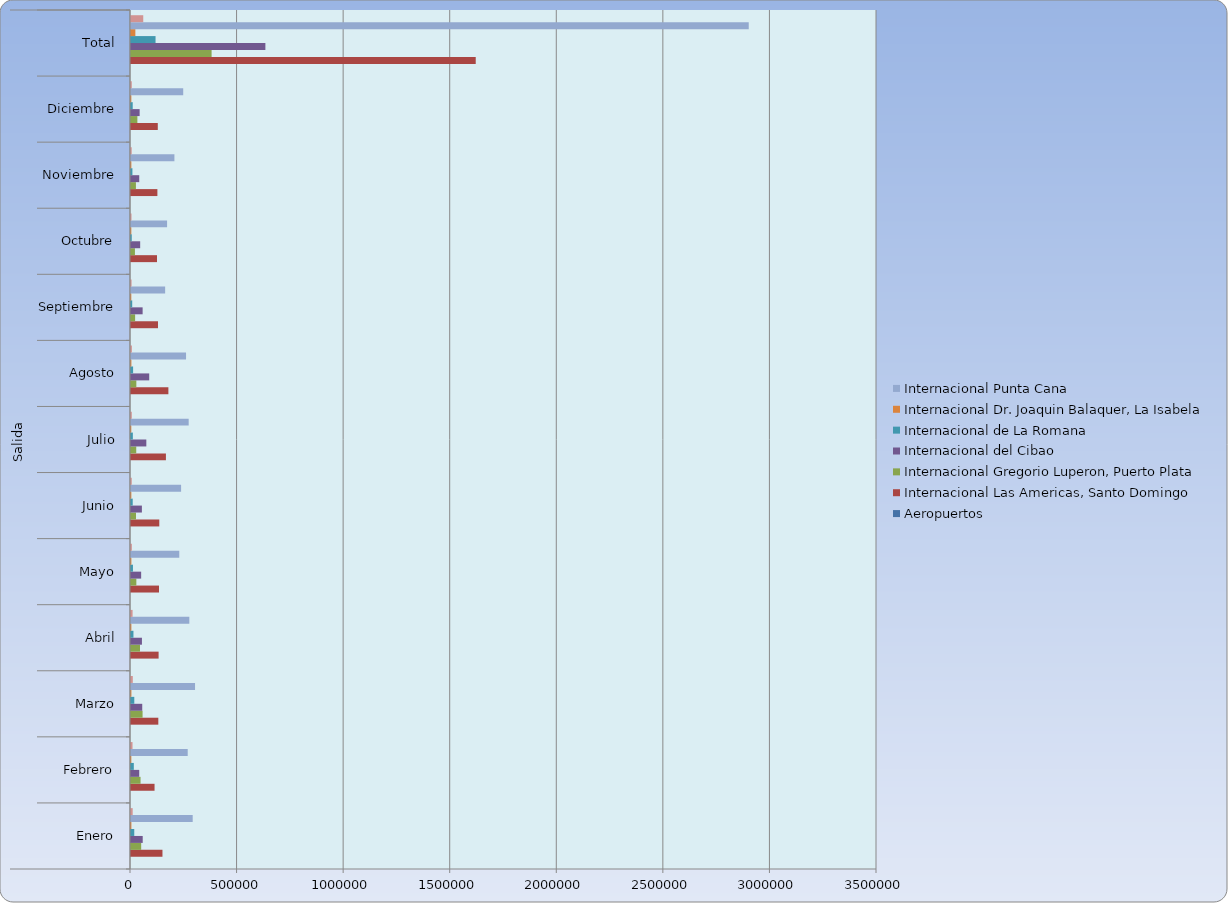
| Category | Aeropuertos | Internacional Las Americas, Santo Domingo | Internacional Gregorio Luperon, Puerto Plata  | Internacional del Cibao | Internacional de La Romana  | Internacional Dr. Joaquin Balaquer, La Isabela | Internacional Punta Cana  | Internacional Profesor Juan Bosch, El Catey (Samana) |
|---|---|---|---|---|---|---|---|---|
| 0 |  | 147614 | 47812 | 54965 | 15292 | 1836 | 289428 | 7859 |
| 1 |  | 110472 | 44794 | 38565 | 13227 | 1578 | 266055 | 7113 |
| 2 |  | 128154 | 54306 | 52724 | 15464 | 1958 | 300477 | 8384 |
| 3 |  | 129521 | 42262 | 51298 | 11484 | 1795 | 273648 | 7434 |
| 4 |  | 131419 | 25081 | 47645 | 9150 | 1862 | 226517 | 3872 |
| 5 |  | 132746 | 23472 | 51088 | 8068 | 1637 | 235039 | 3481 |
| 6 |  | 163825 | 24567 | 71906 | 8674 | 1447 | 270608 | 3667 |
| 7 |  | 175389 | 25061 | 85483 | 9860 | 1922 | 258300 | 4036 |
| 8 |  | 126766 | 19338 | 54555 | 5721 | 1489 | 160203 | 2593 |
| 9 |  | 121936 | 18454 | 43075 | 3530 | 1601 | 169281 | 2238 |
| 10 |  | 123833 | 23076 | 38675 | 6675 | 1708 | 203715 | 3191 |
| 11 |  | 125710 | 29902 | 40537 | 8020 | 1667 | 244983 | 3598 |
| 12 |  | 1617385 | 378125 | 630516 | 115165 | 20500 | 2898254 | 57466 |